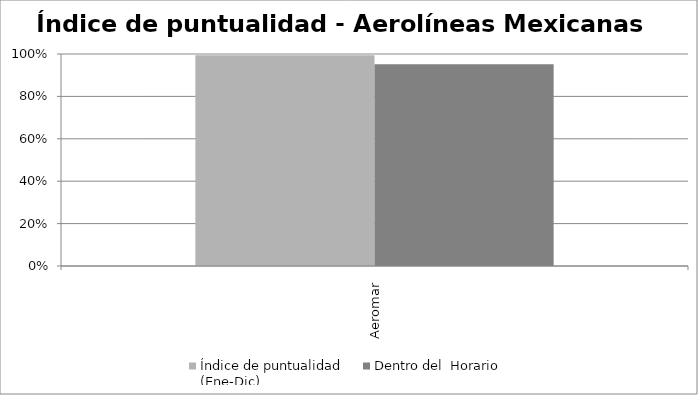
| Category | Índice de puntualidad
(Ene-Dic) | Dentro del  Horario |
|---|---|---|
| Aeromar | 0.994 | 0.951 |